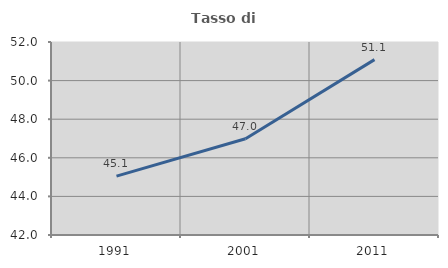
| Category | Tasso di occupazione   |
|---|---|
| 1991.0 | 45.051 |
| 2001.0 | 46.989 |
| 2011.0 | 51.086 |